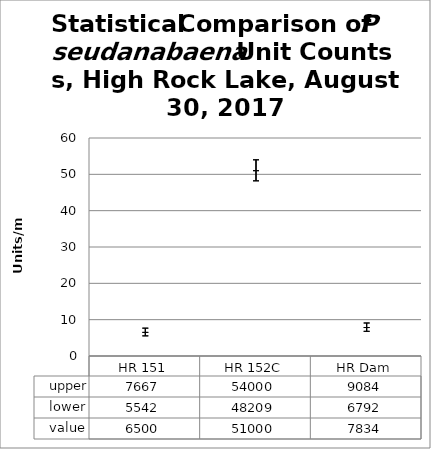
| Category | upper | lower | value |
|---|---|---|---|
| HR 151 | 7667 | 5542 | 6500 |
| HR 152C | 54000 | 48209 | 51000 |
| HR Dam | 9084 | 6792 | 7834 |